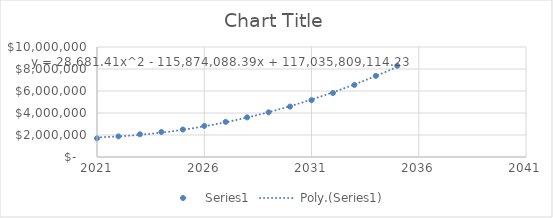
| Category | Series 0 |
|---|---|
| 2021.0 | 1700743.2 |
| 2022.0 | 1874808.6 |
| 2023.0 | 2065203.2 |
| 2024.0 | 2273029.2 |
| 2025.0 | 2499157 |
| 2026.0 | 2824866 |
| 2027.0 | 3190957 |
| 2028.0 | 3602352 |
| 2029.0 | 4064466 |
| 2030.0 | 4583232 |
| 2031.0 | 5165572 |
| 2032.0 | 5819016 |
| 2033.0 | 6551960 |
| 2034.0 | 7373716 |
| 2035.0 | 8294319 |